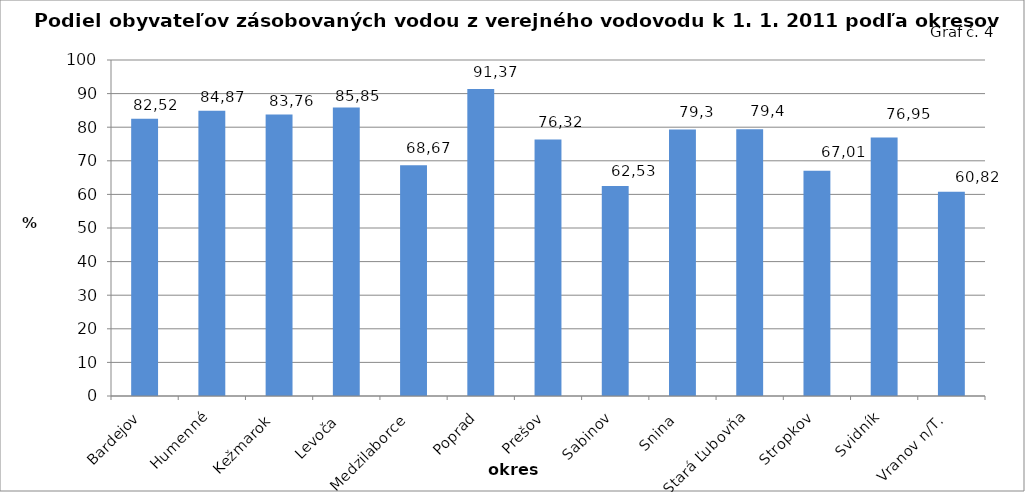
| Category | Series 0 |
|---|---|
| Bardejov | 82.52 |
| Humenné | 84.87 |
| Kežmarok  | 83.76 |
| Levoča  | 85.85 |
| Medzilaborce  | 68.67 |
| Poprad | 91.37 |
| Prešov | 76.32 |
| Sabinov | 62.53 |
| Snina  | 79.3 |
| Stará Ľubovňa | 79.4 |
| Stropkov | 67.01 |
| Svidník | 76.95 |
| Vranov n/T.  | 60.82 |